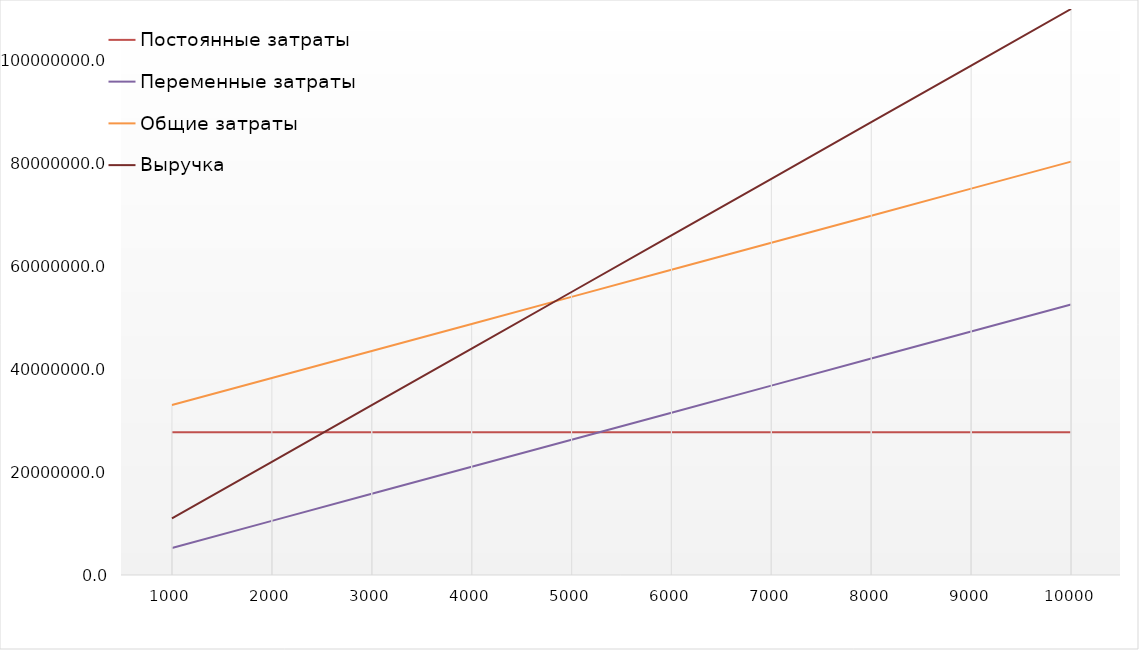
| Category | Постоянные затраты | Переменные затраты | Общие затраты | Выручка |
|---|---|---|---|---|
| 1000.0 | 27765333.646 | 5257930.658 | 33023264.304 | 11000000 |
| 2000.0 | 27765333.646 | 10515861.316 | 38281194.962 | 22000000 |
| 3000.0 | 27765333.646 | 15773791.974 | 43539125.62 | 33000000 |
| 4000.0 | 27765333.646 | 21031722.632 | 48797056.278 | 44000000 |
| 5000.0 | 27765333.646 | 26289653.29 | 54054986.936 | 55000000 |
| 6000.0 | 27765333.646 | 31547583.948 | 59312917.594 | 66000000 |
| 7000.0 | 27765333.646 | 36805514.606 | 64570848.252 | 77000000 |
| 8000.0 | 27765333.646 | 42063445.264 | 69828778.91 | 88000000 |
| 9000.0 | 27765333.646 | 47321375.922 | 75086709.568 | 99000000 |
| 10000.0 | 27765333.646 | 52579306.58 | 80344640.226 | 110000000 |